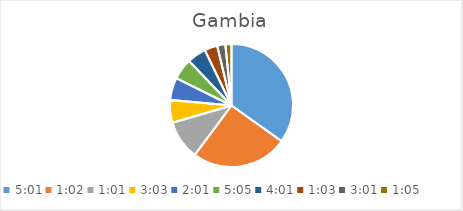
| Category | Series 0 |
|---|---|
| 0.20902777777777778 | 43.244 |
| 0.04305555555555556 | 31.417 |
| 0.042361111111111106 | 12.793 |
| 0.12708333333333333 | 7.426 |
| 0.08402777777777777 | 7.276 |
| 0.21180555555555555 | 6.894 |
| 0.1673611111111111 | 6.2 |
| 0.043750000000000004 | 4.21 |
| 0.12569444444444444 | 2.664 |
| 0.04513888888888889 | 1.985 |